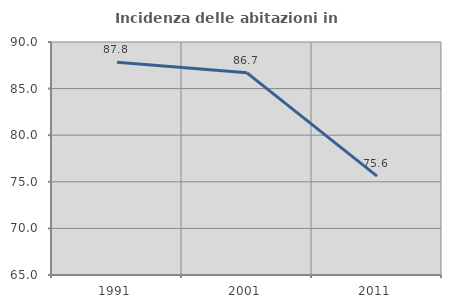
| Category | Incidenza delle abitazioni in proprietà  |
|---|---|
| 1991.0 | 87.838 |
| 2001.0 | 86.691 |
| 2011.0 | 75.61 |